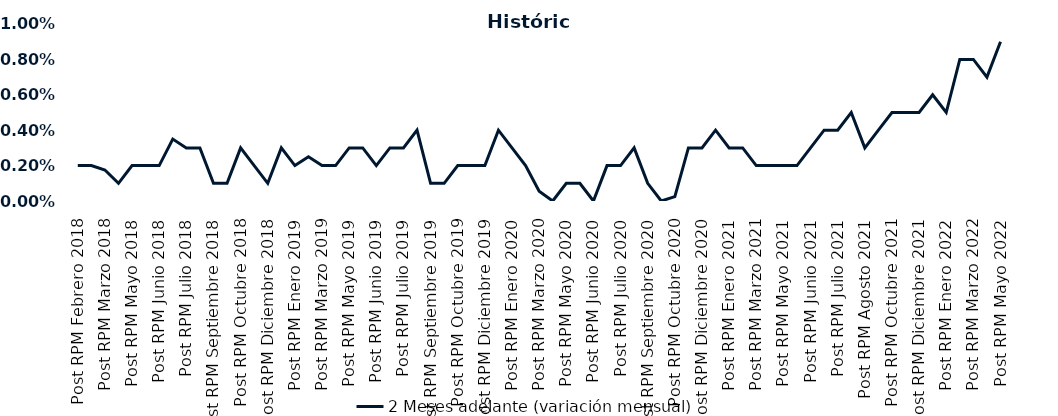
| Category | 2 Meses adelante (variación mensual) |
|---|---|
| Post RPM Febrero 2018 | 0.002 |
| Pre RPM Marzo 2018 | 0.002 |
| Post RPM Marzo 2018 | 0.002 |
| Pre RPM Mayo 2018 | 0.001 |
| Post RPM Mayo 2018 | 0.002 |
| Pre RPM Junio 2018 | 0.002 |
| Post RPM Junio 2018 | 0.002 |
| Pre RPM Julio 2018 | 0.004 |
| Post RPM Julio 2018 | 0.003 |
| Pre RPM Septiembre 2018 | 0.003 |
| Post RPM Septiembre 2018 | 0.001 |
| Pre RPM Octubre 2018 | 0.001 |
| Post RPM Octubre 2018 | 0.003 |
| Pre RPM Diciembre 2018 | 0.002 |
| Post RPM Diciembre 2018 | 0.001 |
| Pre RPM Enero 2019 | 0.003 |
| Post RPM Enero 2019 | 0.002 |
| Pre RPM Marzo 2019 | 0.002 |
| Post RPM Marzo 2019 | 0.002 |
| Pre RPM Mayo 2019 | 0.002 |
| Post RPM Mayo 2019 | 0.003 |
| Pre RPM Junio 2019 | 0.003 |
| Post RPM Junio 2019 | 0.002 |
| Pre RPM Julio 2019 | 0.003 |
| Post RPM Julio 2019 | 0.003 |
| Pre RPM Septiembre 2019 | 0.004 |
| Post RPM Septiembre 2019 | 0.001 |
| Pre RPM Octubre 2019 | 0.001 |
| Post RPM Octubre 2019 | 0.002 |
| Pre RPM Diciembre 2019 | 0.002 |
| Post RPM Diciembre 2019 | 0.002 |
| Pre RPM Enero 2020 | 0.004 |
| Post RPM Enero 2020 | 0.003 |
| Pre RPM Marzo 2020 | 0.002 |
| Post RPM Marzo 2020 | 0.001 |
| Pre RPM Mayo 2020 | 0 |
| Post RPM Mayo 2020 | 0.001 |
| Pre RPM Junio 2020 | 0.001 |
| Post RPM Junio 2020 | 0 |
| Pre RPM Julio 2020 | 0.002 |
| Post RPM Julio 2020 | 0.002 |
| Pre RPM Septiembre 2020 | 0.003 |
| Post RPM Septiembre 2020 | 0.001 |
| Pre RPM Octubre 2020 | 0 |
| Post RPM Octubre 2020 | 0 |
| Pre RPM Diciembre 2020 | 0.003 |
| Post RPM Diciembre 2020 | 0.003 |
| Pre RPM Enero 2021 | 0.004 |
| Post RPM Enero 2021 | 0.003 |
| Pre RPM Marzo 2021 | 0.003 |
| Post RPM Marzo 2021 | 0.002 |
| Pre RPM Mayo 2021 | 0.002 |
| Post RPM Mayo 2021 | 0.002 |
| Pre RPM Junio 2021 | 0.002 |
| Post RPM Junio 2021 | 0.003 |
| Pre RPM Julio 2021 | 0.004 |
| Post RPM Julio 2021 | 0.004 |
| Pre RPM Agosto 2021 | 0.005 |
| Post RPM Agosto 2021 | 0.003 |
| Pre RPM Octubre 2021 | 0.004 |
| Post RPM Octubre 2021 | 0.005 |
| Pre RPM Diciembre 2021 | 0.005 |
| Post RPM Diciembre 2021 | 0.005 |
| Pre RPM Enero 2022 | 0.006 |
| Post RPM Enero 2022 | 0.005 |
| Pre RPM Marzo 2022 | 0.008 |
| Post RPM Marzo 2022 | 0.008 |
| Pre RPM Mayo 2022 | 0.007 |
| Post RPM Mayo 2022 | 0.009 |